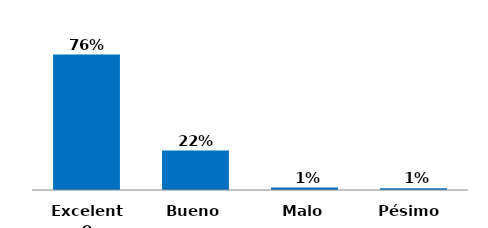
| Category | Series 0 |
|---|---|
| Pésimo  | 0.01 |
| Malo | 0.013 |
| Bueno | 0.22 |
| Excelente | 0.757 |